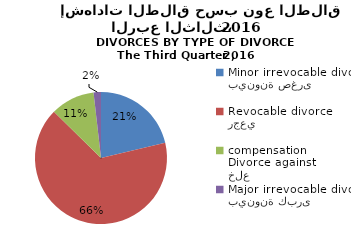
| Category | Series 1 |
|---|---|
| بينونة صغرى
Minor irrevocable divorce  | 59 |
| رجعي
Revocable divorce  | 183 |
| خلع
Divorce against compensation | 30 |
| بينونة كبرى
Major irrevocable divorce  | 5 |